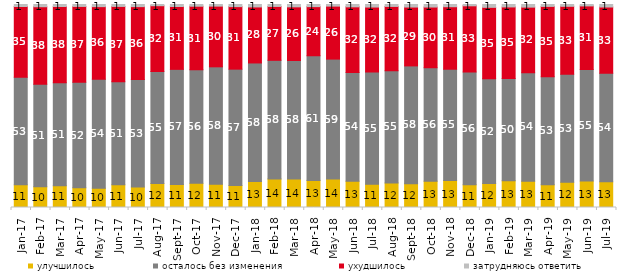
| Category | улучшилось | осталось без изменения | ухудшилось | затрудняюсь ответить |
|---|---|---|---|---|
| 2017-01-01 | 11.15 | 53 | 34.85 | 1 |
| 2017-02-01 | 10.25 | 50.5 | 38.15 | 1.1 |
| 2017-03-01 | 10.7 | 50.75 | 37.5 | 1 |
| 2017-04-01 | 9.7 | 51.95 | 37.4 | 0.95 |
| 2017-05-01 | 9.5 | 53.65 | 35.8 | 1.05 |
| 2017-06-01 | 11.2 | 50.7 | 37.15 | 0.95 |
| 2017-07-01 | 10.05 | 52.95 | 35.95 | 1.05 |
| 2017-08-01 | 11.8 | 55.2 | 32.4 | 0.6 |
| 2017-09-01 | 11.35 | 56.7 | 30.95 | 1 |
| 2017-10-01 | 11.9 | 55.9 | 31.35 | 0.85 |
| 2017-11-01 | 11.45 | 57.85 | 29.9 | 0.8 |
| 2017-12-01 | 10.8 | 57.35 | 30.8 | 1.05 |
| 2018-01-01 | 12.75 | 58.45 | 27.6 | 1.2 |
| 2018-02-01 | 14.1 | 58.4 | 26.55 | 0.95 |
| 2018-03-01 | 14.1 | 58.3 | 26.45 | 1.15 |
| 2018-04-01 | 13.35 | 61.4 | 24.2 | 1.05 |
| 2018-05-01 | 14 | 59.1 | 26.1 | 0.8 |
| 2018-06-01 | 12.95 | 53.5 | 32.4 | 1.15 |
| 2018-07-01 | 11.45 | 55.3 | 32 | 1.25 |
| 2018-08-01 | 12.1 | 55.25 | 31.7 | 0.95 |
| 2018-09-01 | 11.75 | 58 | 29 | 1.25 |
| 2018-10-01 | 12.95 | 55.9 | 29.9 | 1.25 |
| 2018-11-01 | 13.273 | 54.84 | 30.788 | 1.098 |
| 2018-12-01 | 11.2 | 55.6 | 32.55 | 0.65 |
| 2019-01-01 | 11.85 | 51.6 | 35.15 | 1.4 |
| 2019-02-01 | 13.2 | 50.3 | 35.3 | 1.2 |
| 2019-03-01 | 12.929 | 53.506 | 32.273 | 1.293 |
| 2019-04-01 | 11.238 | 53.168 | 34.653 | 0.941 |
| 2019-05-01 | 12.432 | 53.244 | 33.432 | 0.892 |
| 2019-06-01 | 13.017 | 54.963 | 31.322 | 0.698 |
| 2019-07-01 | 12.624 | 53.564 | 32.574 | 1.238 |